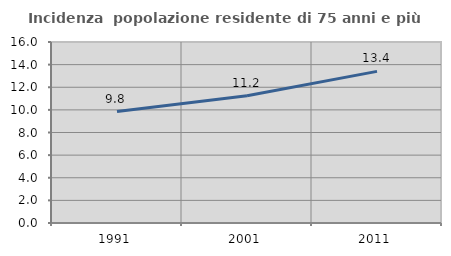
| Category | Incidenza  popolazione residente di 75 anni e più |
|---|---|
| 1991.0 | 9.85 |
| 2001.0 | 11.241 |
| 2011.0 | 13.405 |